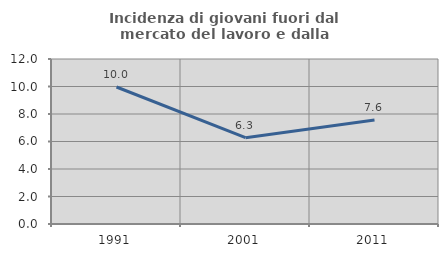
| Category | Incidenza di giovani fuori dal mercato del lavoro e dalla formazione  |
|---|---|
| 1991.0 | 9.963 |
| 2001.0 | 6.276 |
| 2011.0 | 7.566 |